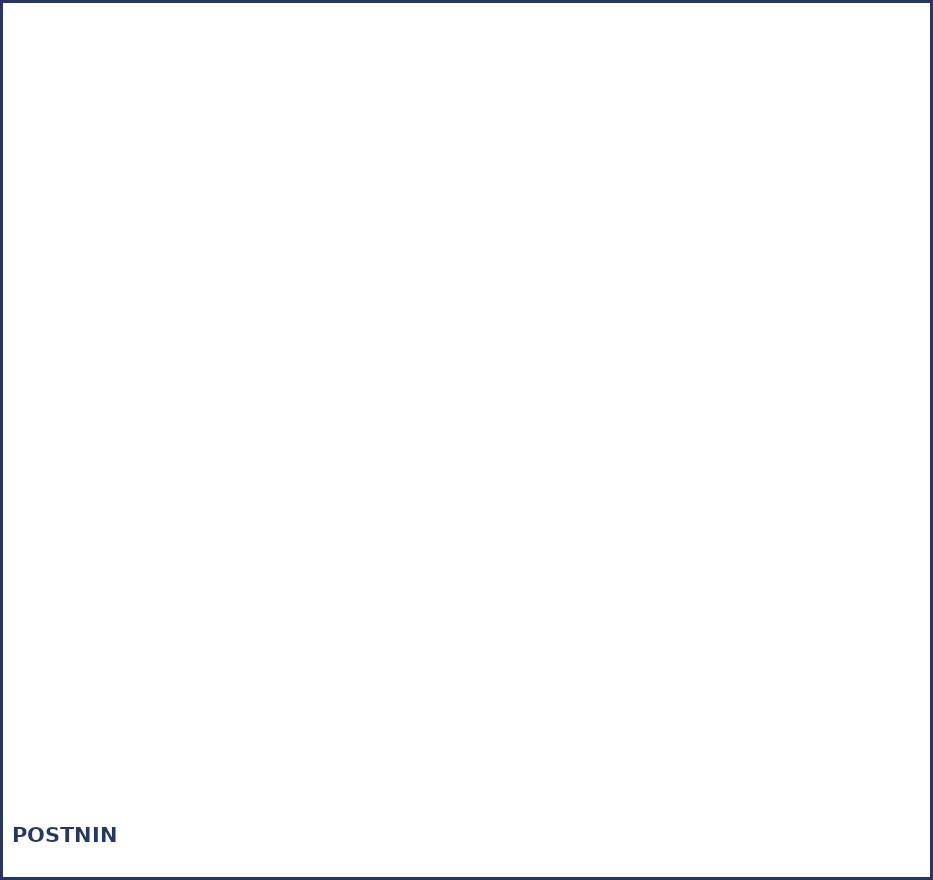
| Category | Series 0 |
|---|---|
| Adventskalender | 0 |
| Skickade brev | 0 |
| Övrig postning | 0 |